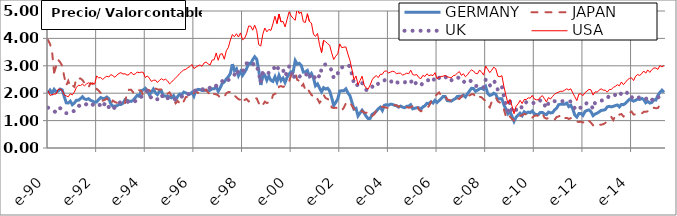
| Category | GERMANY | JAPAN | UK | USA |
|---|---|---|---|---|
| 1990-01-02 | 2 | 3.94 | 1.47 | 2.09 |
| 1990-02-02 | 2.11 | 3.79 | 1.43 | 1.92 |
| 1990-03-02 | 2 | 3.52 | 1.37 | 1.95 |
| 1990-04-02 | 2.14 | 2.76 | 1.35 | 1.97 |
| 1990-05-02 | 2.05 | 3 | 1.29 | 1.97 |
| 1990-06-02 | 2.08 | 3.22 | 1.43 | 2.14 |
| 1990-07-02 | 2.15 | 3.13 | 1.45 | 2.15 |
| 1990-08-02 | 2.12 | 3 | 1.42 | 2.11 |
| 1990-09-02 | 1.88 | 2.61 | 1.35 | 1.94 |
| 1990-10-02 | 1.65 | 2.28 | 1.27 | 1.9 |
| 1990-11-02 | 1.64 | 2.45 | 1.27 | 1.87 |
| 1990-12-02 | 1.71 | 2.22 | 1.34 | 1.98 |
| 1991-01-02 | 1.58 | 2.28 | 1.34 | 1.94 |
| 1991-02-02 | 1.64 | 2.23 | 1.35 | 2.04 |
| 1991-03-02 | 1.74 | 2.55 | 1.48 | 2.21 |
| 1991-04-02 | 1.74 | 2.52 | 1.53 | 2.29 |
| 1991-05-02 | 1.8 | 2.54 | 1.56 | 2.28 |
| 1991-06-02 | 1.87 | 2.48 | 1.56 | 2.33 |
| 1991-07-02 | 1.79 | 2.37 | 1.53 | 2.27 |
| 1991-08-02 | 1.77 | 2.34 | 1.61 | 2.34 |
| 1991-09-02 | 1.8 | 2.22 | 1.65 | 2.38 |
| 1991-10-02 | 1.74 | 2.36 | 1.66 | 2.34 |
| 1991-11-02 | 1.71 | 2.35 | 1.59 | 2.37 |
| 1991-12-02 | 1.67 | 2.12 | 1.51 | 2.33 |
| 1992-01-02 | 1.68 | 2.16 | 1.54 | 2.63 |
| 1992-02-02 | 1.77 | 2.09 | 1.56 | 2.56 |
| 1992-03-02 | 1.84 | 2.01 | 1.58 | 2.57 |
| 1992-04-02 | 1.81 | 1.73 | 1.48 | 2.5 |
| 1992-05-02 | 1.81 | 1.75 | 1.63 | 2.57 |
| 1992-06-02 | 1.86 | 1.81 | 1.66 | 2.62 |
| 1992-07-02 | 1.8 | 1.72 | 1.49 | 2.59 |
| 1992-08-02 | 1.61 | 1.61 | 1.45 | 2.68 |
| 1992-09-02 | 1.52 | 1.73 | 1.38 | 2.64 |
| 1992-10-02 | 1.53 | 1.68 | 1.5 | 2.58 |
| 1992-11-02 | 1.54 | 1.65 | 1.6 | 2.66 |
| 1992-12-02 | 1.59 | 1.68 | 1.65 | 2.72 |
| 1993-01-02 | 1.59 | 1.68 | 1.67 | 2.75 |
| 1993-02-02 | 1.63 | 1.68 | 1.67 | 2.7 |
| 1993-03-02 | 1.76 | 1.65 | 1.7 | 2.71 |
| 1993-04-02 | 1.74 | 2.02 | 1.7 | 2.66 |
| 1993-05-02 | 1.71 | 2.13 | 1.66 | 2.68 |
| 1993-06-02 | 1.7 | 2.13 | 1.68 | 2.77 |
| 1993-07-02 | 1.74 | 2.03 | 1.67 | 2.68 |
| 1993-08-02 | 1.83 | 2.1 | 1.71 | 2.7 |
| 1993-09-02 | 1.92 | 2.17 | 1.78 | 2.77 |
| 1993-10-02 | 1.89 | 2.11 | 1.78 | 2.75 |
| 1993-11-02 | 2.09 | 2.08 | 1.87 | 2.77 |
| 1993-12-02 | 2.12 | 1.9 | 1.91 | 2.76 |
| 1994-01-02 | 2.18 | 1.88 | 2.01 | 2.57 |
| 1994-02-02 | 2.09 | 2.13 | 2.09 | 2.63 |
| 1994-03-02 | 1.94 | 2.11 | 1.93 | 2.55 |
| 1994-04-02 | 2.03 | 2.03 | 1.83 | 2.43 |
| 1994-05-02 | 2.15 | 2.05 | 1.86 | 2.47 |
| 1994-06-02 | 2.02 | 2.17 | 1.77 | 2.48 |
| 1994-07-02 | 1.95 | 2.14 | 1.78 | 2.39 |
| 1994-08-02 | 2.07 | 2.13 | 1.9 | 2.47 |
| 1994-09-02 | 2.08 | 2.14 | 1.95 | 2.53 |
| 1994-10-02 | 1.89 | 2.06 | 1.8 | 2.48 |
| 1994-11-02 | 1.9 | 2.05 | 1.86 | 2.51 |
| 1994-12-02 | 1.9 | 1.98 | 1.82 | 2.45 |
| 1995-01-02 | 1.86 | 2.03 | 1.81 | 2.34 |
| 1995-02-02 | 1.83 | 1.88 | 1.77 | 2.41 |
| 1995-03-02 | 1.91 | 1.75 | 1.74 | 2.49 |
| 1995-04-02 | 1.76 | 1.63 | 1.79 | 2.56 |
| 1995-05-02 | 1.88 | 1.72 | 1.85 | 2.63 |
| 1995-06-02 | 1.97 | 1.63 | 1.89 | 2.72 |
| 1995-07-02 | 1.95 | 1.57 | 1.87 | 2.79 |
| 1995-08-02 | 2.04 | 1.71 | 1.97 | 2.85 |
| 1995-09-02 | 2.01 | 1.86 | 1.99 | 2.87 |
| 1995-10-02 | 1.98 | 1.86 | 1.97 | 2.93 |
| 1995-11-02 | 1.97 | 1.89 | 1.95 | 2.97 |
| 1995-12-02 | 2.03 | 1.93 | 2.04 | 3.05 |
| 1996-01-02 | 1.89 | 2.01 | 2.07 | 2.9 |
| 1996-02-02 | 2.1 | 2.07 | 2.11 | 2.95 |
| 1996-03-02 | 2.14 | 2.01 | 2.1 | 3 |
| 1996-04-02 | 2.13 | 2.05 | 2.12 | 3.03 |
| 1996-05-02 | 2.1 | 2.11 | 2.15 | 2.98 |
| 1996-06-02 | 2.1 | 2.07 | 2.13 | 3.1 |
| 1996-07-02 | 2.11 | 2.13 | 2.11 | 3.14 |
| 1996-08-02 | 2.08 | 2.03 | 2.13 | 3.07 |
| 1996-09-02 | 2.11 | 1.94 | 2.21 | 3.03 |
| 1996-10-02 | 2.16 | 2.04 | 2.27 | 3.21 |
| 1996-11-02 | 2.16 | 1.97 | 2.22 | 3.22 |
| 1996-12-02 | 2.23 | 1.96 | 2.27 | 3.47 |
| 1997-01-02 | 2.07 | 1.92 | 2.3 | 3.2 |
| 1997-02-02 | 2.2 | 1.83 | 2.4 | 3.43 |
| 1997-03-02 | 2.36 | 1.83 | 2.44 | 3.44 |
| 1997-04-02 | 2.41 | 1.86 | 2.37 | 3.24 |
| 1997-05-02 | 2.52 | 2 | 2.44 | 3.55 |
| 1997-06-02 | 2.6 | 2.04 | 2.48 | 3.67 |
| 1997-07-02 | 2.72 | 2.05 | 2.55 | 3.94 |
| 1997-08-02 | 3.06 | 2.05 | 2.61 | 4.14 |
| 1997-09-02 | 2.82 | 1.91 | 2.67 | 4.06 |
| 1997-10-02 | 2.89 | 1.85 | 2.86 | 4.17 |
| 1997-11-02 | 2.64 | 1.78 | 2.72 | 4.05 |
| 1997-12-02 | 2.79 | 1.76 | 2.72 | 4.2 |
| 1998-01-02 | 2.65 | 1.64 | 2.75 | 3.95 |
| 1998-02-02 | 2.76 | 1.75 | 2.95 | 4 |
| 1998-03-02 | 2.89 | 1.79 | 3.09 | 4.17 |
| 1998-04-02 | 3.09 | 1.7 | 3.09 | 4.45 |
| 1998-05-02 | 3.07 | 1.73 | 3.12 | 4.45 |
| 1998-06-02 | 3.22 | 1.74 | 3.04 | 4.3 |
| 1998-07-02 | 3.33 | 1.81 | 3.09 | 4.48 |
| 1998-08-02 | 3.24 | 1.81 | 3.03 | 4.29 |
| 1998-09-02 | 2.84 | 1.64 | 2.72 | 3.77 |
| 1998-10-02 | 2.3 | 1.5 | 2.44 | 3.72 |
| 1998-11-02 | 2.66 | 1.57 | 2.75 | 4.15 |
| 1998-12-02 | 2.66 | 1.69 | 2.74 | 4.38 |
| 1999-01-02 | 2.47 | 1.64 | 2.67 | 4.24 |
| 1999-02-02 | 2.62 | 1.67 | 2.75 | 4.33 |
| 1999-03-02 | 2.47 | 1.66 | 2.76 | 4.29 |
| 1999-04-02 | 2.43 | 1.93 | 2.82 | 4.53 |
| 1999-05-02 | 2.6 | 1.98 | 2.99 | 4.81 |
| 1999-06-02 | 2.41 | 1.99 | 2.86 | 4.54 |
| 1999-07-02 | 2.65 | 2.24 | 2.97 | 4.89 |
| 1999-08-02 | 2.46 | 2.26 | 2.91 | 4.6 |
| 1999-09-02 | 2.55 | 2.23 | 2.85 | 4.62 |
| 1999-10-02 | 2.39 | 2.26 | 2.62 | 4.42 |
| 1999-11-02 | 2.58 | 2.35 | 2.78 | 4.7 |
| 1999-12-02 | 2.7 | 2.43 | 2.98 | 4.97 |
| 2000-01-02 | 2.78 | 2.66 | 2.87 | 4.82 |
| 2000-02-02 | 2.78 | 2.66 | 2.52 | 4.73 |
| 2000-03-02 | 3.19 | 2.75 | 2.68 | 4.66 |
| 2000-04-02 | 3.06 | 2.49 | 2.6 | 5.12 |
| 2000-05-02 | 3.09 | 2.45 | 2.6 | 4.91 |
| 2000-06-02 | 3.01 | 2.24 | 2.65 | 4.96 |
| 2000-07-02 | 2.77 | 2.33 | 2.62 | 4.61 |
| 2000-08-02 | 2.78 | 2.12 | 2.62 | 4.58 |
| 2000-09-02 | 2.83 | 2.19 | 2.76 | 4.9 |
| 2000-10-02 | 2.62 | 2.05 | 2.6 | 4.62 |
| 2000-11-02 | 2.72 | 1.94 | 2.66 | 4.56 |
| 2000-12-02 | 2.56 | 1.88 | 2.52 | 4.16 |
| 2001-01-02 | 2.27 | 1.75 | 2.61 | 4.07 |
| 2001-02-02 | 2.34 | 1.79 | 2.72 | 4.18 |
| 2001-03-02 | 2.19 | 1.65 | 2.58 | 3.77 |
| 2001-04-02 | 2.05 | 1.74 | 2.89 | 3.48 |
| 2001-05-02 | 2.2 | 1.94 | 3.04 | 3.93 |
| 2001-06-02 | 2.15 | 1.82 | 3.05 | 3.88 |
| 2001-07-02 | 2.18 | 1.79 | 2.98 | 3.81 |
| 2001-08-02 | 2.08 | 1.72 | 2.95 | 3.75 |
| 2001-09-02 | 1.84 | 1.48 | 2.83 | 3.47 |
| 2001-10-02 | 1.55 | 1.46 | 2.56 | 3.23 |
| 2001-11-02 | 1.66 | 1.47 | 2.72 | 3.35 |
| 2001-12-02 | 1.79 | 1.45 | 2.72 | 3.44 |
| 2002-01-02 | 2.08 | 1.46 | 2.92 | 3.8 |
| 2002-02-02 | 2.09 | 1.37 | 2.94 | 3.66 |
| 2002-03-02 | 2.09 | 1.47 | 2.97 | 3.68 |
| 2002-04-02 | 2.16 | 1.63 | 3.04 | 3.69 |
| 2002-05-02 | 2.01 | 1.63 | 3.02 | 3.43 |
| 2002-06-02 | 1.91 | 1.68 | 2.98 | 3.2 |
| 2002-07-02 | 1.67 | 1.54 | 2.68 | 2.87 |
| 2002-08-02 | 1.42 | 1.42 | 2.36 | 2.49 |
| 2002-09-02 | 1.45 | 1.38 | 2.41 | 2.63 |
| 2002-10-02 | 1.17 | 1.33 | 2.23 | 2.31 |
| 2002-11-02 | 1.28 | 1.31 | 2.27 | 2.46 |
| 2002-12-02 | 1.38 | 1.36 | 2.37 | 2.62 |
| 2003-01-02 | 1.28 | 1.29 | 2.3 | 2.3 |
| 2003-02-02 | 1.16 | 1.29 | 2.12 | 2.19 |
| 2003-03-02 | 1.07 | 1.29 | 2.11 | 2.15 |
| 2003-04-02 | 1.08 | 1.15 | 2.11 | 2.3 |
| 2003-05-02 | 1.23 | 1.17 | 2.23 | 2.49 |
| 2003-06-02 | 1.27 | 1.23 | 2.34 | 2.59 |
| 2003-07-02 | 1.34 | 1.36 | 2.29 | 2.64 |
| 2003-08-02 | 1.43 | 1.37 | 2.35 | 2.57 |
| 2003-09-02 | 1.49 | 1.48 | 2.42 | 2.69 |
| 2003-10-02 | 1.37 | 1.51 | 2.41 | 2.69 |
| 2003-11-02 | 1.56 | 1.49 | 2.47 | 2.8 |
| 2003-12-02 | 1.58 | 1.47 | 2.49 | 2.81 |
| 2004-01-02 | 1.56 | 1.46 | 2.45 | 2.74 |
| 2004-02-02 | 1.6 | 1.48 | 2.39 | 2.77 |
| 2004-03-02 | 1.59 | 1.57 | 2.48 | 2.8 |
| 2004-04-02 | 1.56 | 1.56 | 2.4 | 2.78 |
| 2004-05-02 | 1.54 | 1.56 | 2.41 | 2.71 |
| 2004-06-02 | 1.49 | 1.5 | 2.37 | 2.73 |
| 2004-07-02 | 1.53 | 1.55 | 2.36 | 2.73 |
| 2004-08-02 | 1.49 | 1.5 | 2.35 | 2.66 |
| 2004-09-02 | 1.47 | 1.51 | 2.39 | 2.69 |
| 2004-10-02 | 1.52 | 1.49 | 2.45 | 2.73 |
| 2004-11-02 | 1.53 | 1.47 | 2.45 | 2.71 |
| 2004-12-02 | 1.58 | 1.48 | 2.48 | 2.84 |
| 2005-01-02 | 1.43 | 1.53 | 2.28 | 2.68 |
| 2005-02-02 | 1.45 | 1.54 | 2.35 | 2.66 |
| 2005-03-02 | 1.47 | 1.59 | 2.39 | 2.68 |
| 2005-04-02 | 1.47 | 1.4 | 2.36 | 2.57 |
| 2005-05-02 | 1.41 | 1.34 | 2.28 | 2.53 |
| 2005-06-02 | 1.5 | 1.37 | 2.38 | 2.65 |
| 2005-07-02 | 1.54 | 1.42 | 2.4 | 2.61 |
| 2005-08-02 | 1.63 | 1.45 | 2.48 | 2.71 |
| 2005-09-02 | 1.62 | 1.53 | 2.47 | 2.64 |
| 2005-10-02 | 1.69 | 1.68 | 2.53 | 2.67 |
| 2005-11-02 | 1.64 | 1.77 | 2.45 | 2.64 |
| 2005-12-02 | 1.74 | 1.89 | 2.57 | 2.75 |
| 2006-01-02 | 1.66 | 1.96 | 2.49 | 2.53 |
| 2006-02-02 | 1.73 | 2.03 | 2.56 | 2.58 |
| 2006-03-02 | 1.8 | 1.92 | 2.61 | 2.61 |
| 2006-04-02 | 1.88 | 1.94 | 2.62 | 2.62 |
| 2006-05-02 | 1.88 | 1.91 | 2.63 | 2.65 |
| 2006-06-02 | 1.73 | 1.77 | 2.47 | 2.6 |
| 2006-07-02 | 1.72 | 1.75 | 2.5 | 2.58 |
| 2006-08-02 | 1.71 | 1.73 | 2.47 | 2.56 |
| 2006-09-02 | 1.76 | 1.79 | 2.51 | 2.64 |
| 2006-10-02 | 1.8 | 1.8 | 2.5 | 2.66 |
| 2006-11-02 | 1.88 | 1.8 | 2.58 | 2.73 |
| 2006-12-02 | 1.89 | 1.79 | 2.55 | 2.79 |
| 2007-01-02 | 1.88 | 1.87 | 2.43 | 2.65 |
| 2007-02-02 | 1.93 | 1.96 | 2.44 | 2.71 |
| 2007-03-02 | 1.86 | 1.93 | 2.37 | 2.6 |
| 2007-04-02 | 1.98 | 1.89 | 2.43 | 2.67 |
| 2007-05-02 | 2.08 | 1.92 | 2.47 | 2.78 |
| 2007-06-02 | 2.18 | 1.96 | 2.43 | 2.85 |
| 2007-07-02 | 2.17 | 1.97 | 2.38 | 2.81 |
| 2007-08-02 | 2.07 | 1.86 | 2.26 | 2.72 |
| 2007-09-02 | 2.11 | 1.8 | 2.27 | 2.71 |
| 2007-10-02 | 2.16 | 1.87 | 2.29 | 2.85 |
| 2007-11-02 | 2.18 | 1.85 | 2.28 | 2.76 |
| 2007-12-02 | 2.14 | 1.77 | 2.21 | 2.66 |
| 2008-01-02 | 2.24 | 1.72 | 2.49 | 2.99 |
| 2008-02-02 | 1.99 | 1.56 | 2.33 | 2.87 |
| 2008-03-02 | 1.92 | 1.48 | 2.27 | 2.75 |
| 2008-04-02 | 1.94 | 1.69 | 2.37 | 2.84 |
| 2008-05-02 | 2 | 1.79 | 2.47 | 2.95 |
| 2008-06-02 | 1.96 | 1.85 | 2.33 | 2.89 |
| 2008-07-02 | 1.78 | 1.7 | 2.11 | 2.62 |
| 2008-08-02 | 1.8 | 1.66 | 2.1 | 2.6 |
| 2008-09-02 | 1.8 | 1.59 | 2.24 | 2.64 |
| 2008-10-02 | 1.57 | 1.41 | 1.89 | 2.24 |
| 2008-11-02 | 1.42 | 1.15 | 1.55 | 1.92 |
| 2008-12-02 | 1.25 | 1.05 | 1.36 | 1.62 |
| 2009-01-02 | 1.34 | 1.15 | 1.69 | 1.77 |
| 2009-02-02 | 1.15 | 1.06 | 1.35 | 1.53 |
| 2009-03-02 | 0.97 | 1 | 1.28 | 1.25 |
| 2009-04-02 | 1.12 | 1.07 | 1.39 | 1.52 |
| 2009-05-02 | 1.2 | 1.09 | 1.52 | 1.61 |
| 2009-06-02 | 1.27 | 1.17 | 1.54 | 1.74 |
| 2009-07-02 | 1.18 | 1.2 | 1.46 | 1.62 |
| 2009-08-02 | 1.32 | 1.24 | 1.6 | 1.77 |
| 2009-09-02 | 1.27 | 1.23 | 1.67 | 1.77 |
| 2009-10-02 | 1.31 | 1.14 | 1.68 | 1.83 |
| 2009-11-02 | 1.29 | 1.14 | 1.67 | 1.82 |
| 2009-12-02 | 1.35 | 1.11 | 1.69 | 1.92 |
| 2010-01-02 | 1.25 | 1.17 | 1.61 | 1.79 |
| 2010-02-02 | 1.22 | 1.19 | 1.63 | 1.76 |
| 2010-03-02 | 1.22 | 1.17 | 1.68 | 1.76 |
| 2010-04-02 | 1.3 | 1.26 | 1.74 | 1.86 |
| 2010-05-02 | 1.3 | 1.26 | 1.74 | 1.91 |
| 2010-06-02 | 1.24 | 1.11 | 1.58 | 1.8 |
| 2010-07-02 | 1.22 | 1.07 | 1.45 | 1.68 |
| 2010-08-02 | 1.31 | 1.09 | 1.64 | 1.84 |
| 2010-09-02 | 1.28 | 1.05 | 1.61 | 1.79 |
| 2010-10-02 | 1.29 | 1.07 | 1.68 | 1.88 |
| 2010-11-02 | 1.39 | 1.03 | 1.71 | 1.96 |
| 2010-12-02 | 1.45 | 1.13 | 1.7 | 2.01 |
| 2011-01-02 | 1.58 | 1.15 | 1.68 | 2.04 |
| 2011-02-02 | 1.6 | 1.19 | 1.71 | 2.07 |
| 2011-03-02 | 1.6 | 1.21 | 1.71 | 2.07 |
| 2011-04-02 | 1.6 | 1.09 | 1.72 | 2.11 |
| 2011-05-02 | 1.64 | 1.1 | 1.73 | 2.16 |
| 2011-06-02 | 1.51 | 1.06 | 1.7 | 2.12 |
| 2011-07-02 | 1.56 | 1.09 | 1.7 | 2.16 |
| 2011-08-02 | 1.42 | 1.08 | 1.6 | 2.01 |
| 2011-09-02 | 1.2 | 0.99 | 1.44 | 1.87 |
| 2011-10-02 | 1.13 | 0.96 | 1.38 | 1.73 |
| 2011-11-02 | 1.26 | 0.95 | 1.47 | 1.97 |
| 2011-12-02 | 1.26 | 0.96 | 1.47 | 1.98 |
| 2012-01-02 | 1.19 | 0.93 | 1.48 | 1.91 |
| 2012-02-02 | 1.33 | 0.97 | 1.6 | 2.02 |
| 2012-03-02 | 1.37 | 1.06 | 1.64 | 2.08 |
| 2012-04-02 | 1.39 | 0.99 | 1.63 | 2.14 |
| 2012-05-02 | 1.32 | 0.92 | 1.57 | 2.12 |
| 2012-06-02 | 1.18 | 0.83 | 1.42 | 1.93 |
| 2012-07-02 | 1.24 | 0.9 | 1.66 | 2.05 |
| 2012-08-02 | 1.27 | 0.86 | 1.65 | 2.04 |
| 2012-09-02 | 1.32 | 0.85 | 1.7 | 2.11 |
| 2012-10-02 | 1.37 | 0.85 | 1.73 | 2.16 |
| 2012-11-02 | 1.38 | 0.87 | 1.74 | 2.11 |
| 2012-12-02 | 1.4 | 0.91 | 1.74 | 2.11 |
| 2013-01-02 | 1.5 | 0.99 | 1.81 | 2.04 |
| 2013-02-02 | 1.52 | 1.08 | 1.91 | 2.13 |
| 2013-03-02 | 1.5 | 1.13 | 1.94 | 2.14 |
| 2013-04-02 | 1.52 | 1.02 | 1.9 | 2.21 |
| 2013-05-02 | 1.55 | 1.19 | 1.94 | 2.25 |
| 2013-06-02 | 1.57 | 1.14 | 1.96 | 2.31 |
| 2013-07-02 | 1.5 | 1.22 | 1.89 | 2.27 |
| 2013-08-02 | 1.59 | 1.24 | 2.01 | 2.41 |
| 2013-09-02 | 1.58 | 1.15 | 1.98 | 2.31 |
| 2013-10-02 | 1.63 | 1.2 | 1.94 | 2.4 |
| 2013-11-02 | 1.71 | 1.21 | 2.04 | 2.49 |
| 2013-12-02 | 1.78 | 1.29 | 2 | 2.54 |
| 2014-01-02 | 1.75 | 1.33 | 1.86 | 2.56 |
| 2014-02-02 | 1.71 | 1.22 | 1.79 | 2.46 |
| 2014-03-02 | 1.74 | 1.23 | 1.84 | 2.62 |
| 2014-04-02 | 1.79 | 1.25 | 1.83 | 2.68 |
| 2014-05-02 | 1.77 | 1.22 | 1.85 | 2.65 |
| 2014-06-02 | 1.81 | 1.26 | 1.87 | 2.71 |
| 2014-07-02 | 1.77 | 1.32 | 1.84 | 2.81 |
| 2014-08-02 | 1.65 | 1.32 | 1.79 | 2.73 |
| 2014-09-02 | 1.7 | 1.34 | 1.83 | 2.85 |
| 2014-10-02 | 1.64 | 1.32 | 1.72 | 2.76 |
| 2014-11-02 | 1.66 | 1.37 | 1.75 | 2.86 |
| 2014-12-02 | 1.76 | 1.47 | 1.8 | 2.92 |
| 2015-01-02 | 1.75 | 1.45 | 1.76 | 2.92 |
| 2015-02-02 | 1.92 | 1.46 | 1.84 | 2.87 |
| 2015-03-02 | 2.03 | 1.58 | 1.9 | 3.01 |
| 2015-04-02 | 2.11 | 1.61 | 1.87 | 2.96 |
| 2015-05-02 | 2.03 | 1.64 | 1.94 | 3.01 |